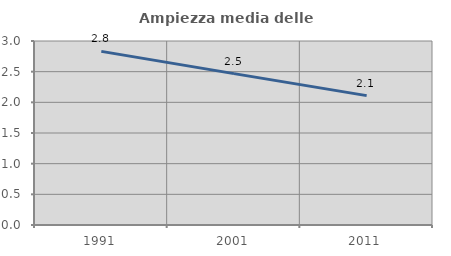
| Category | Ampiezza media delle famiglie |
|---|---|
| 1991.0 | 2.831 |
| 2001.0 | 2.468 |
| 2011.0 | 2.109 |